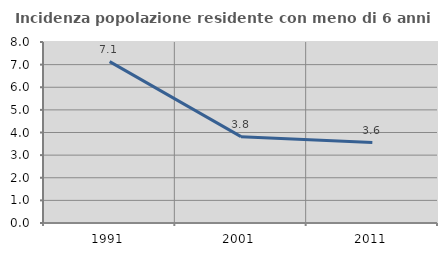
| Category | Incidenza popolazione residente con meno di 6 anni |
|---|---|
| 1991.0 | 7.132 |
| 2001.0 | 3.817 |
| 2011.0 | 3.554 |